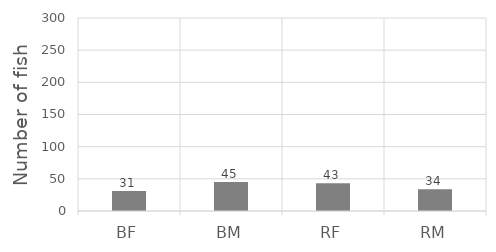
| Category | Series 0 |
|---|---|
| BF | 31 |
| BM | 45 |
| RF | 43 |
| RM | 34 |